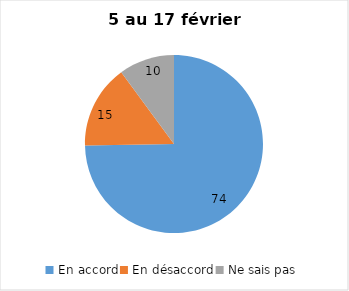
| Category | Series 0 |
|---|---|
| En accord | 74 |
| En désaccord | 15 |
| Ne sais pas | 10 |